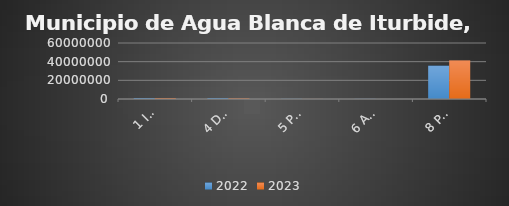
| Category | 2022 | 2023 |
|---|---|---|
| 1 IMPUESTOS | 1023287 | 921916 |
| 4 DERECHOS | 1008685.31 | 721884.91 |
| 5 PRODUCTOS | 205468.13 | 78044.7 |
| 6 APROVECHAMIENTOS | 161150 | 2600 |
| 8 PARTICIPACIONES  | 35743868.57 | 41391413.04 |